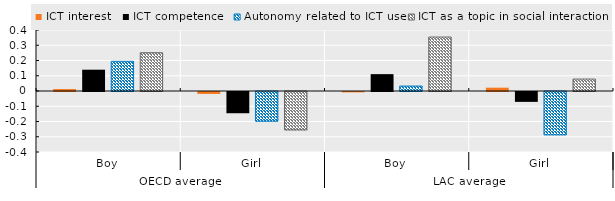
| Category | ICT interest  | ICT competence  | Autonomy related to ICT use | ICT as a topic in social interaction  |
|---|---|---|---|---|
| 0 | 0.013 | 0.14 | 0.195 | 0.251 |
| 1 | -0.013 | -0.139 | -0.195 | -0.252 |
| 2 | -0.002 | 0.111 | 0.032 | 0.354 |
| 3 | 0.022 | -0.065 | -0.284 | 0.078 |